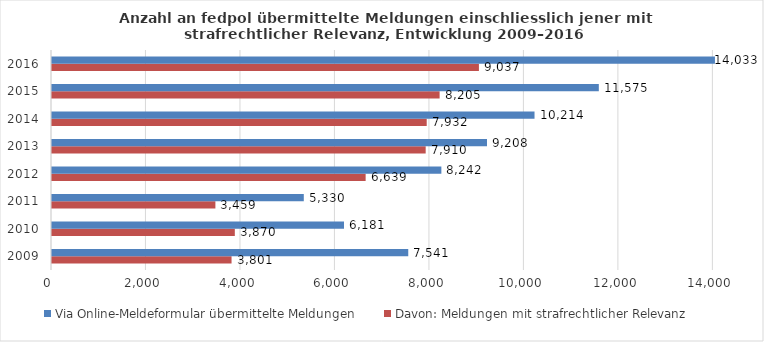
| Category | Davon: Meldungen mit strafrechtlicher Relevanz | Via Online-Meldeformular übermittelte Meldungen |
|---|---|---|
| 2009.0 | 3800.664 | 7541 |
| 2010.0 | 3869.924 | 6181 |
| 2011.0 | 3458.637 | 5330 |
| 2012.0 | 6639 | 8242 |
| 2013.0 | 7910 | 9208 |
| 2014.0 | 7932 | 10214 |
| 2015.0 | 8205 | 11575 |
| 2016.0 | 9037 | 14033 |